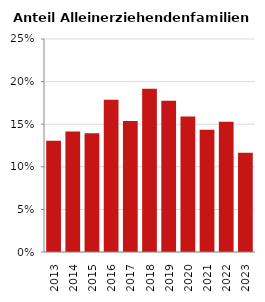
| Category | Anteil Alleinerziehende an Familien |
|---|---|
| 2013.0 | 0.131 |
| 2014.0 | 0.141 |
| 2015.0 | 0.139 |
| 2016.0 | 0.179 |
| 2017.0 | 0.154 |
| 2018.0 | 0.192 |
| 2019.0 | 0.178 |
| 2020.0 | 0.159 |
| 2021.0 | 0.143 |
| 2022.0 | 0.153 |
| 2023.0 | 0.117 |